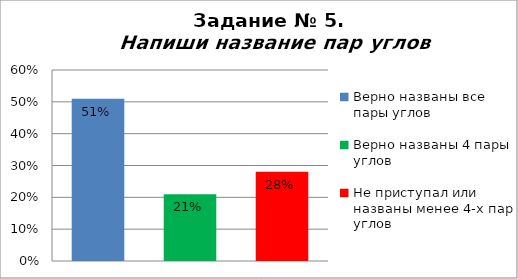
| Category | Напиши название пар углов |
|---|---|
| Верно названы все пары углов | 0.51 |
| Верно названы 4 пары углов | 0.21 |
| Не приступал или названы менее 4-х пар углов | 0.28 |